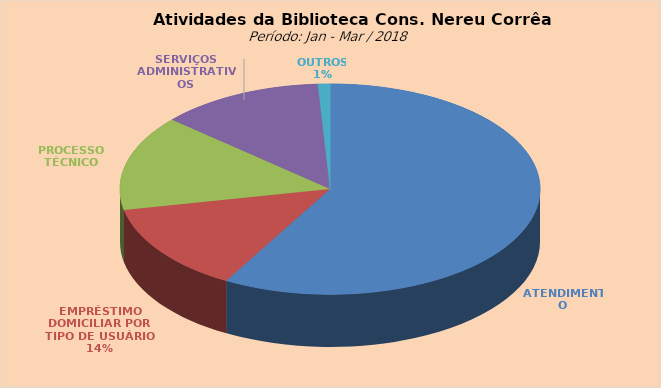
| Category | Series 0 |
|---|---|
| ATENDIMENTO | 2566 |
| EMPRÉSTIMO DOMICILIAR POR TIPO DE USUÁRIO | 601 |
| PROCESSO TÉCNICO | 645 |
| SERVIÇOS ADMINISTRATIVOS | 556 |
| OUTROS | 41 |